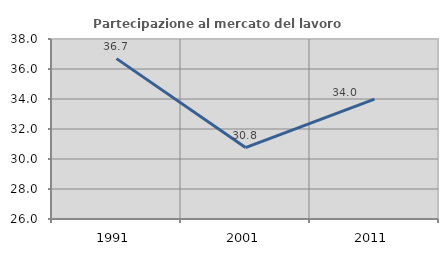
| Category | Partecipazione al mercato del lavoro  femminile |
|---|---|
| 1991.0 | 36.691 |
| 2001.0 | 30.76 |
| 2011.0 | 33.989 |